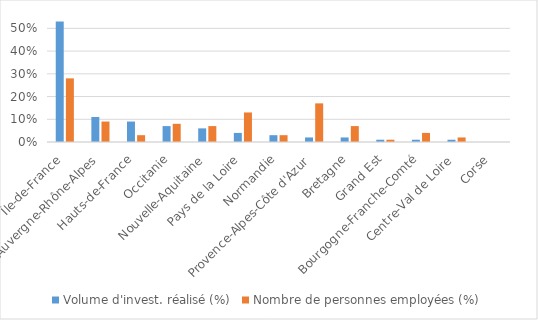
| Category | Volume d'invest. réalisé (%) | Nombre de personnes employées (%) |
|---|---|---|
| Île-de-France | 0.53 | 0.28 |
| Auvergne-Rhône-Alpes | 0.11 | 0.09 |
| Hauts-de-France | 0.09 | 0.03 |
| Occitanie | 0.07 | 0.08 |
| Nouvelle-Aquitaine | 0.06 | 0.07 |
| Pays de la Loire | 0.04 | 0.13 |
| Normandie | 0.03 | 0.03 |
| Provence-Alpes-Côte d'Azur | 0.02 | 0.17 |
| Bretagne | 0.02 | 0.07 |
| Grand Est | 0.01 | 0.01 |
| Bourgogne-Franche-Comté | 0.01 | 0.04 |
| Centre-Val de Loire | 0.01 | 0.02 |
| Corse | 0 | 0 |